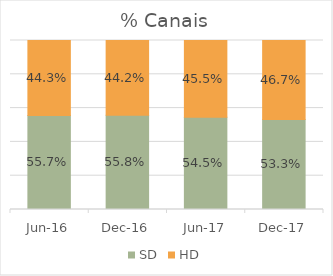
| Category | SD | HD |
|---|---|---|
| 2016-06-01 | 0.557 | 0.443 |
| 2016-12-01 | 0.558 | 0.442 |
| 2017-06-01 | 0.545 | 0.455 |
| 2017-12-01 | 0.533 | 0.467 |